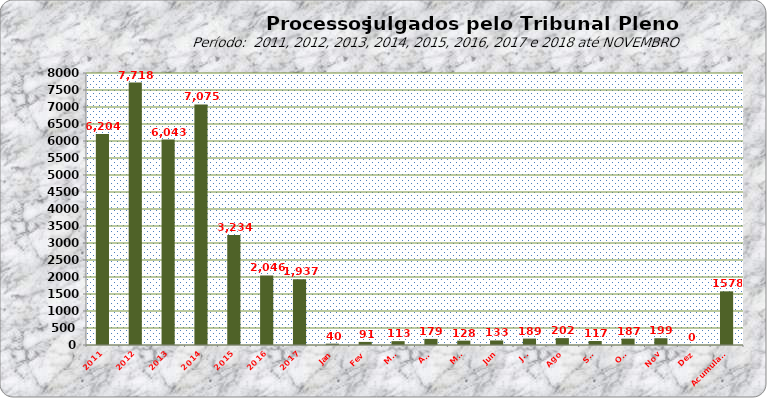
| Category | Series 0 |
|---|---|
| 2011 | 6204 |
| 2012 | 7718 |
| 2013 | 6043 |
| 2014 | 7075 |
| 2015 | 3234 |
| 2016 | 2046 |
| 2017 | 1937 |
| Jan | 40 |
| Fev | 91 |
| Mar | 113 |
| Abr | 179 |
| Mai | 128 |
| Jun | 133 |
| Jul | 189 |
| Ago | 202 |
| Set | 117 |
| Out | 187 |
| Nov | 199 |
| Dez | 0 |
| Acumulado | 1578 |